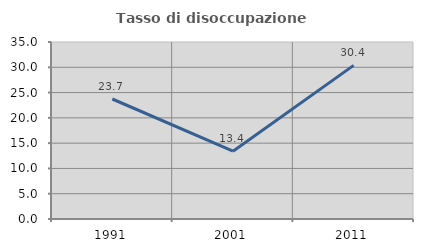
| Category | Tasso di disoccupazione giovanile  |
|---|---|
| 1991.0 | 23.729 |
| 2001.0 | 13.402 |
| 2011.0 | 30.38 |